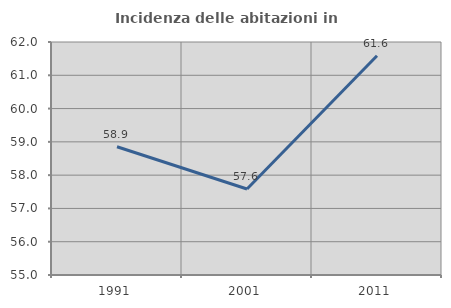
| Category | Incidenza delle abitazioni in proprietà  |
|---|---|
| 1991.0 | 58.854 |
| 2001.0 | 57.583 |
| 2011.0 | 61.588 |